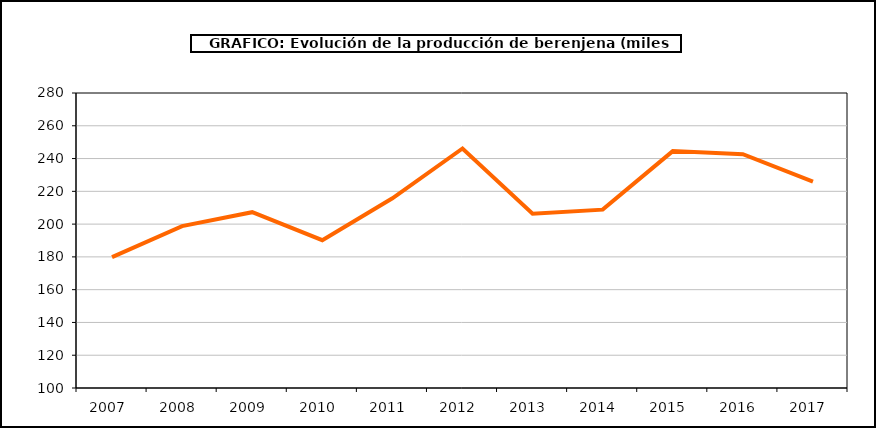
| Category | producción |
|---|---|
| 2007.0 | 179.826 |
| 2008.0 | 198.768 |
| 2009.0 | 207.269 |
| 2010.0 | 190.195 |
| 2011.0 | 215.769 |
| 2012.0 | 246.142 |
| 2013.0 | 206.333 |
| 2014.0 | 208.821 |
| 2015.0 | 244.54 |
| 2016.0 | 242.643 |
| 2017.0 | 225.912 |